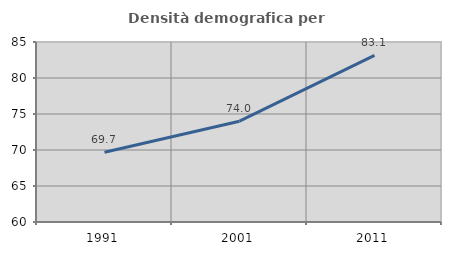
| Category | Densità demografica |
|---|---|
| 1991.0 | 69.679 |
| 2001.0 | 74.004 |
| 2011.0 | 83.134 |